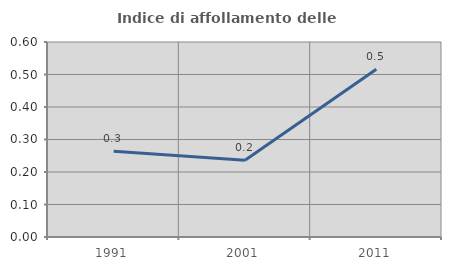
| Category | Indice di affollamento delle abitazioni  |
|---|---|
| 1991.0 | 0.264 |
| 2001.0 | 0.236 |
| 2011.0 | 0.516 |